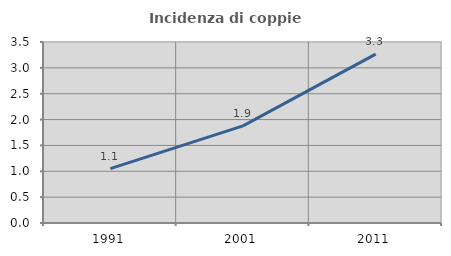
| Category | Incidenza di coppie miste |
|---|---|
| 1991.0 | 1.053 |
| 2001.0 | 1.878 |
| 2011.0 | 3.265 |